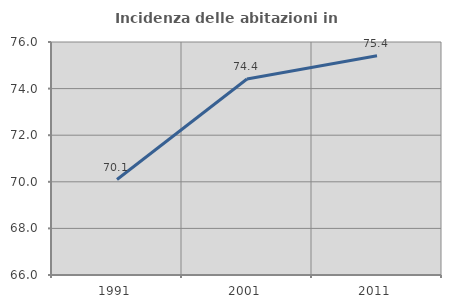
| Category | Incidenza delle abitazioni in proprietà  |
|---|---|
| 1991.0 | 70.098 |
| 2001.0 | 74.412 |
| 2011.0 | 75.409 |